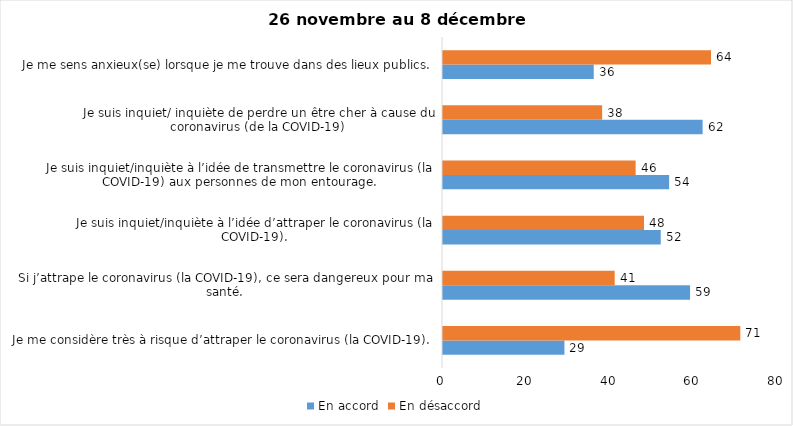
| Category | En accord | En désaccord |
|---|---|---|
| Je me considère très à risque d’attraper le coronavirus (la COVID-19). | 29 | 71 |
| Si j’attrape le coronavirus (la COVID-19), ce sera dangereux pour ma santé. | 59 | 41 |
| Je suis inquiet/inquiète à l’idée d’attraper le coronavirus (la COVID-19). | 52 | 48 |
| Je suis inquiet/inquiète à l’idée de transmettre le coronavirus (la COVID-19) aux personnes de mon entourage. | 54 | 46 |
| Je suis inquiet/ inquiète de perdre un être cher à cause du coronavirus (de la COVID-19) | 62 | 38 |
| Je me sens anxieux(se) lorsque je me trouve dans des lieux publics. | 36 | 64 |